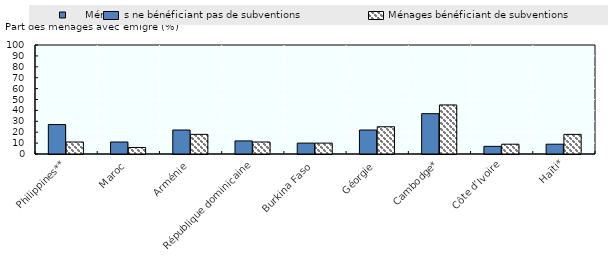
| Category |      Ménages ne bénéficiant pas de subventions |   Ménages bénéficiant de subventions |
|---|---|---|
| Philippines** | 27 | 11 |
| Maroc | 11 | 6 |
| Arménie | 22 | 18 |
| République dominicaine | 12 | 11 |
| Burkina Faso | 10 | 10 |
| Géorgie | 22 | 25 |
| Cambodge* | 37 | 45 |
| Côte d’Ivoire | 7 | 9 |
| Haïti* | 9 | 18 |